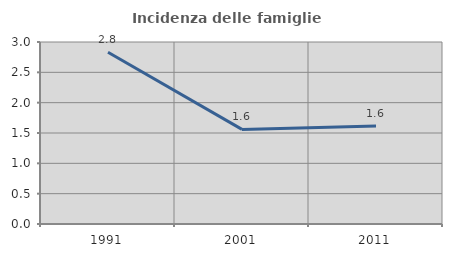
| Category | Incidenza delle famiglie numerose |
|---|---|
| 1991.0 | 2.831 |
| 2001.0 | 1.56 |
| 2011.0 | 1.617 |